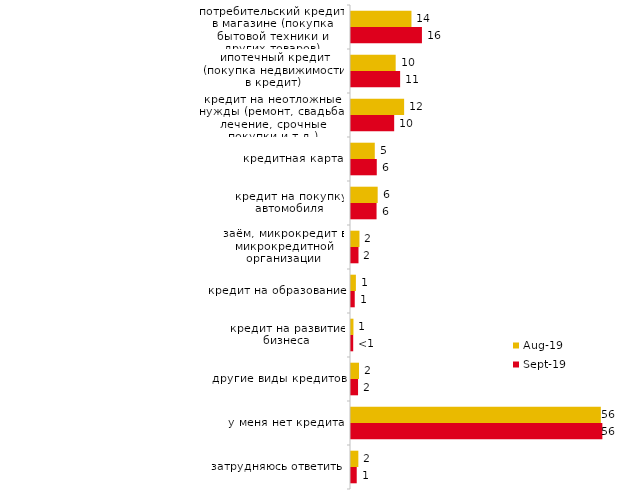
| Category | авг.19 | сен.19 |
|---|---|---|
| потребительский кредит в магазине (покупка бытовой техники и других товаров) | 13.586 | 15.941 |
| ипотечный кредит (покупка недвижимости в кредит) | 10.04 | 11.04 |
| кредит на неотложные нужды (ремонт, свадьба, лечение, срочные покупки и т.д.) | 11.938 | 9.703 |
| кредитная карта | 5.345 | 5.792 |
| кредит на покупку автомобиля | 5.994 | 5.743 |
| заём, микрокредит в микрокредитной организации | 1.898 | 1.683 |
| кредит на образование | 1.099 | 0.842 |
| кредит на развитие бизнеса | 0.549 | 0.495 |
| другие виды кредитов | 1.798 | 1.584 |
| у меня нет кредита | 56.144 | 56.485 |
| затрудняюсь ответить | 1.648 | 1.287 |